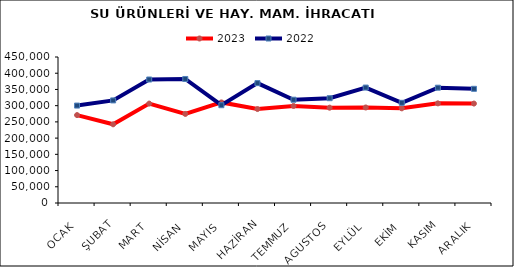
| Category | 2023 | 2022 |
|---|---|---|
| OCAK | 270948.651 | 300295.32 |
| ŞUBAT | 242539.377 | 316201.99 |
| MART | 306412.233 | 380631.509 |
| NİSAN | 274546.708 | 382265.558 |
| MAYIS | 310016.059 | 301401.85 |
| HAZİRAN | 289588.083 | 369497.391 |
| TEMMUZ | 299245.196 | 318336.141 |
| AGUSTOS | 293787.62 | 323036.572 |
| EYLÜL | 294390.009 | 355787.517 |
| EKİM | 291782.161 | 308775.104 |
| KASIM | 307121.943 | 355407.832 |
| ARALIK | 306479.406 | 351943.732 |